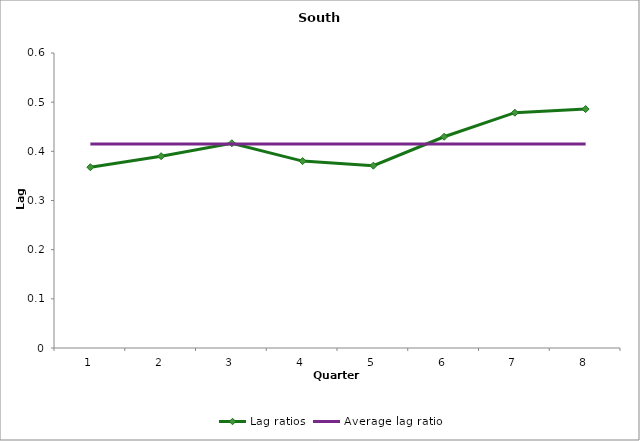
| Category | Lag ratios | Average lag ratio |
|---|---|---|
| 0 | 0.368 | 0.415 |
| 1 | 0.39 | 0.415 |
| 2 | 0.416 | 0.415 |
| 3 | 0.38 | 0.415 |
| 4 | 0.371 | 0.415 |
| 5 | 0.43 | 0.415 |
| 6 | 0.479 | 0.415 |
| 7 | 0.486 | 0.415 |